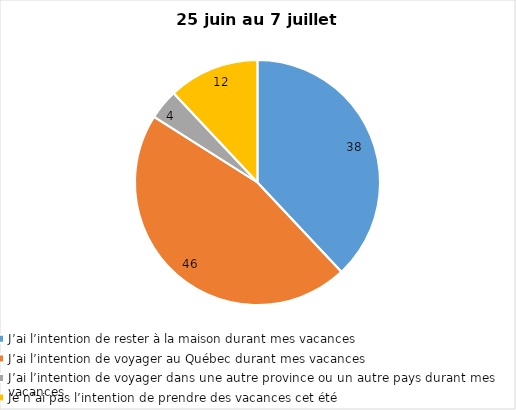
| Category | Series 0 |
|---|---|
| J’ai l’intention de rester à la maison durant mes vacances | 38 |
| J’ai l’intention de voyager au Québec durant mes vacances | 46 |
| J’ai l’intention de voyager dans une autre province ou un autre pays durant mes vacances | 4 |
| Je n’ai pas l’intention de prendre des vacances cet été | 12 |